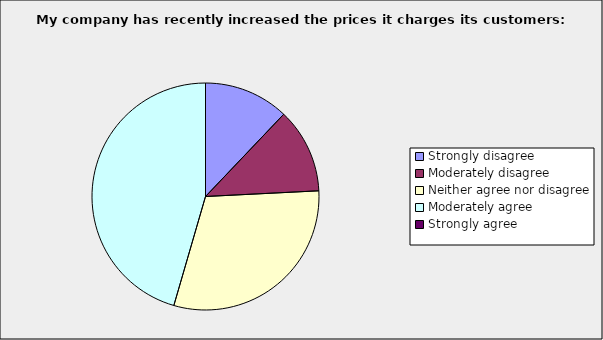
| Category | Series 0 |
|---|---|
| Strongly disagree | 0.121 |
| Moderately disagree | 0.121 |
| Neither agree nor disagree | 0.303 |
| Moderately agree | 0.455 |
| Strongly agree | 0 |